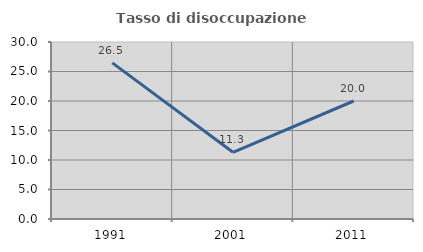
| Category | Tasso di disoccupazione giovanile  |
|---|---|
| 1991.0 | 26.455 |
| 2001.0 | 11.304 |
| 2011.0 | 20 |